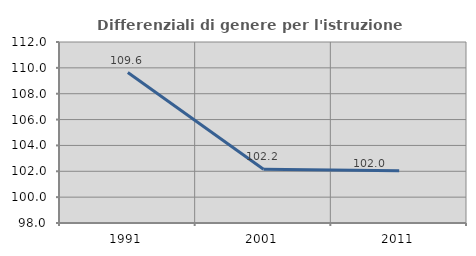
| Category | Differenziali di genere per l'istruzione superiore |
|---|---|
| 1991.0 | 109.64 |
| 2001.0 | 102.163 |
| 2011.0 | 102.043 |